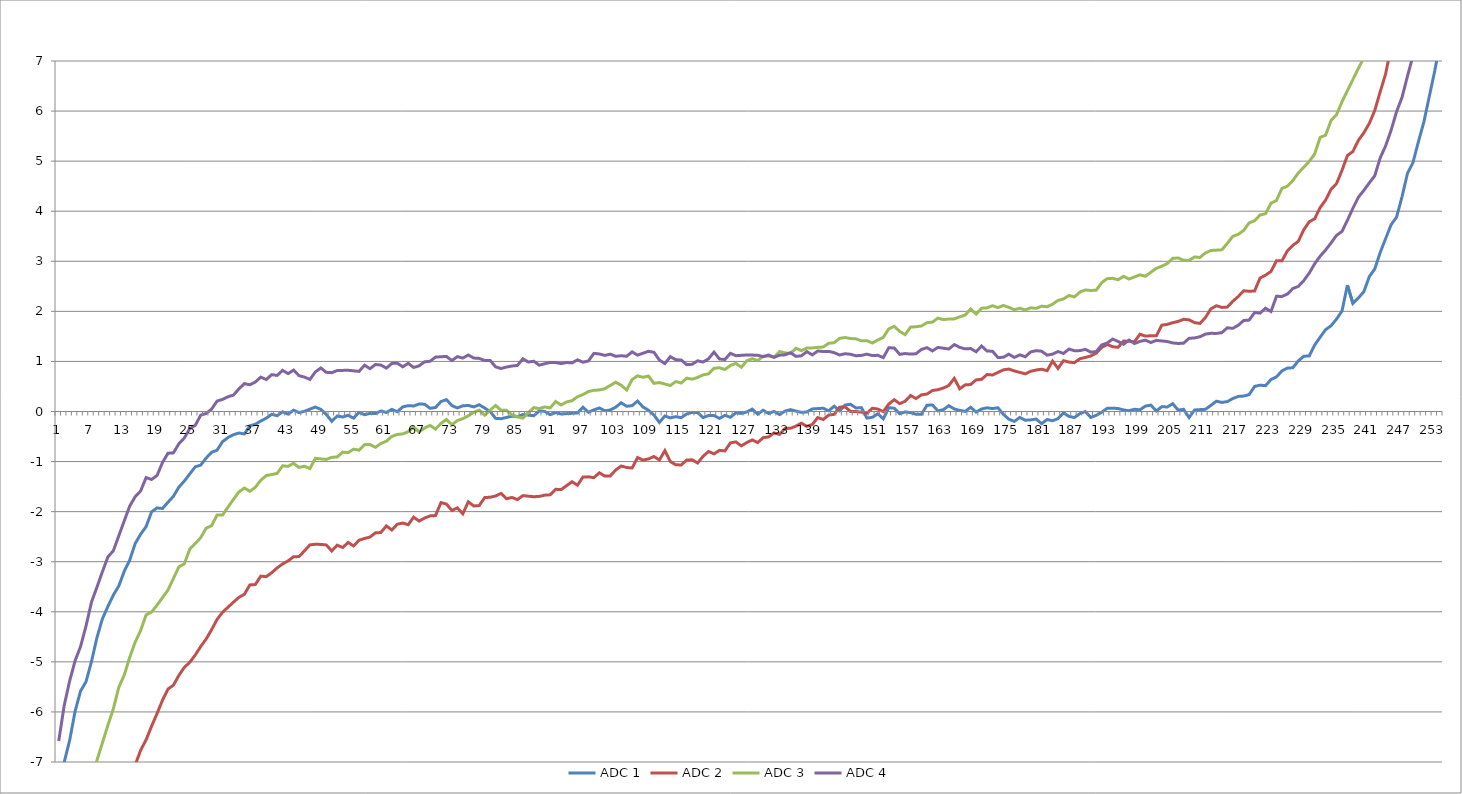
| Category | ADC 1 | ADC 2 | ADC 3 | ADC 4 |
|---|---|---|---|---|
| 0 | -7.732 | -15.212 | -11.184 | -6.581 |
| 1 | -7.006 | -13.64 | -9.972 | -5.873 |
| 2 | -6.567 | -12.968 | -9.417 | -5.381 |
| 3 | -5.985 | -12.062 | -8.79 | -4.978 |
| 4 | -5.583 | -11.399 | -8.37 | -4.693 |
| 5 | -5.396 | -10.862 | -7.913 | -4.281 |
| 6 | -4.993 | -10.352 | -7.443 | -3.807 |
| 7 | -4.515 | -9.769 | -6.964 | -3.508 |
| 8 | -4.139 | -9.358 | -6.616 | -3.2 |
| 9 | -3.894 | -8.982 | -6.267 | -2.905 |
| 10 | -3.667 | -8.571 | -5.937 | -2.781 |
| 11 | -3.485 | -8.231 | -5.507 | -2.482 |
| 12 | -3.19 | -7.874 | -5.262 | -2.183 |
| 13 | -2.967 | -7.525 | -4.909 | -1.889 |
| 14 | -2.637 | -7.06 | -4.606 | -1.702 |
| 15 | -2.45 | -6.765 | -4.374 | -1.587 |
| 16 | -2.299 | -6.556 | -4.062 | -1.32 |
| 17 | -2.005 | -6.284 | -4.005 | -1.358 |
| 18 | -1.926 | -6.035 | -3.868 | -1.279 |
| 19 | -1.937 | -5.767 | -3.717 | -1.02 |
| 20 | -1.813 | -5.544 | -3.566 | -0.833 |
| 21 | -1.694 | -5.465 | -3.335 | -0.827 |
| 22 | -1.512 | -5.27 | -3.103 | -0.644 |
| 23 | -1.388 | -5.11 | -3.042 | -0.53 |
| 24 | -1.246 | -5.009 | -2.748 | -0.338 |
| 25 | -1.105 | -4.863 | -2.637 | -0.278 |
| 26 | -1.071 | -4.694 | -2.518 | -0.073 |
| 27 | -0.929 | -4.543 | -2.332 | -0.039 |
| 28 | -0.814 | -4.356 | -2.28 | 0.049 |
| 29 | -0.771 | -4.152 | -2.066 | 0.208 |
| 30 | -0.603 | -4.01 | -2.068 | 0.242 |
| 31 | -0.519 | -3.909 | -1.908 | 0.294 |
| 32 | -0.463 | -3.807 | -1.753 | 0.328 |
| 33 | -0.429 | -3.711 | -1.607 | 0.452 |
| 34 | -0.449 | -3.65 | -1.528 | 0.558 |
| 35 | -0.285 | -3.463 | -1.593 | 0.533 |
| 36 | -0.256 | -3.456 | -1.514 | 0.589 |
| 37 | -0.19 | -3.288 | -1.373 | 0.686 |
| 38 | -0.134 | -3.299 | -1.28 | 0.639 |
| 39 | -0.055 | -3.22 | -1.26 | 0.736 |
| 40 | -0.084 | -3.123 | -1.235 | 0.72 |
| 41 | -0.006 | -3.044 | -1.084 | 0.822 |
| 42 | -0.053 | -2.983 | -1.095 | 0.757 |
| 43 | 0.026 | -2.9 | -1.035 | 0.826 |
| 44 | -0.021 | -2.898 | -1.118 | 0.716 |
| 45 | 0.004 | -2.783 | -1.093 | 0.687 |
| 46 | 0.047 | -2.664 | -1.14 | 0.64 |
| 47 | 0.09 | -2.652 | -0.935 | 0.791 |
| 48 | 0.043 | -2.654 | -0.946 | 0.87 |
| 49 | -0.058 | -2.665 | -0.957 | 0.782 |
| 50 | -0.195 | -2.784 | -0.914 | 0.776 |
| 51 | -0.089 | -2.67 | -0.908 | 0.819 |
| 52 | -0.11 | -2.717 | -0.811 | 0.821 |
| 53 | -0.076 | -2.615 | -0.822 | 0.823 |
| 54 | -0.132 | -2.685 | -0.752 | 0.812 |
| 55 | -0.017 | -2.57 | -0.772 | 0.801 |
| 56 | -0.064 | -2.536 | -0.662 | 0.925 |
| 57 | -0.039 | -2.507 | -0.659 | 0.855 |
| 58 | -0.041 | -2.424 | -0.716 | 0.939 |
| 59 | 0.011 | -2.417 | -0.637 | 0.928 |
| 60 | -0.018 | -2.284 | -0.594 | 0.867 |
| 61 | 0.042 | -2.367 | -0.497 | 0.959 |
| 62 | -0.005 | -2.252 | -0.459 | 0.966 |
| 63 | 0.092 | -2.227 | -0.447 | 0.892 |
| 64 | 0.117 | -2.261 | -0.404 | 0.962 |
| 65 | 0.11 | -2.11 | -0.308 | 0.879 |
| 66 | 0.149 | -2.189 | -0.409 | 0.913 |
| 67 | 0.147 | -2.128 | -0.33 | 0.992 |
| 68 | 0.064 | -2.085 | -0.278 | 1.003 |
| 69 | 0.079 | -2.078 | -0.352 | 1.086 |
| 70 | 0.199 | -1.82 | -0.237 | 1.093 |
| 71 | 0.237 | -1.849 | -0.158 | 1.1 |
| 72 | 0.118 | -1.977 | -0.264 | 1.017 |
| 73 | 0.071 | -1.925 | -0.181 | 1.096 |
| 74 | 0.114 | -2.044 | -0.142 | 1.067 |
| 75 | 0.121 | -1.803 | -0.086 | 1.128 |
| 76 | 0.092 | -1.886 | -0.016 | 1.067 |
| 77 | 0.135 | -1.879 | 0.027 | 1.061 |
| 78 | 0.07 | -1.719 | -0.074 | 1.018 |
| 79 | 0 | -1.713 | 0.027 | 1.02 |
| 80 | -0.137 | -1.688 | 0.119 | 0.892 |
| 81 | -0.143 | -1.636 | 0.027 | 0.859 |
| 82 | -0.119 | -1.741 | 0.025 | 0.888 |
| 83 | -0.094 | -1.716 | -0.067 | 0.909 |
| 84 | -0.105 | -1.759 | -0.105 | 0.92 |
| 85 | -0.062 | -1.68 | -0.134 | 1.053 |
| 86 | -0.073 | -1.691 | -0.019 | 0.988 |
| 87 | -0.084 | -1.702 | 0.078 | 1.004 |
| 88 | 0.013 | -1.696 | 0.058 | 0.925 |
| 89 | 0.002 | -1.671 | 0.091 | 0.954 |
| 90 | -0.064 | -1.664 | 0.071 | 0.979 |
| 91 | -0.021 | -1.553 | 0.2 | 0.977 |
| 92 | -0.05 | -1.56 | 0.13 | 0.957 |
| 93 | -0.043 | -1.481 | 0.191 | 0.978 |
| 94 | -0.036 | -1.402 | 0.216 | 0.971 |
| 95 | -0.029 | -1.472 | 0.295 | 1.032 |
| 96 | 0.086 | -1.308 | 0.337 | 0.985 |
| 97 | -0.015 | -1.305 | 0.398 | 1.01 |
| 98 | 0.032 | -1.321 | 0.423 | 1.16 |
| 99 | 0.07 | -1.224 | 0.43 | 1.149 |
| 100 | 0.014 | -1.289 | 0.455 | 1.12 |
| 101 | 0.03 | -1.287 | 0.52 | 1.145 |
| 102 | 0.087 | -1.168 | 0.586 | 1.102 |
| 103 | 0.174 | -1.089 | 0.525 | 1.114 |
| 104 | 0.105 | -1.118 | 0.429 | 1.103 |
| 105 | 0.116 | -1.129 | 0.638 | 1.191 |
| 106 | 0.209 | -0.92 | 0.712 | 1.126 |
| 107 | 0.09 | -0.971 | 0.683 | 1.164 |
| 108 | 0.025 | -0.946 | 0.708 | 1.202 |
| 109 | -0.072 | -0.899 | 0.562 | 1.182 |
| 110 | -0.218 | -0.969 | 0.578 | 1.027 |
| 111 | -0.09 | -0.782 | 0.549 | 0.958 |
| 112 | -0.128 | -1 | 0.52 | 1.095 |
| 113 | -0.103 | -1.065 | 0.598 | 1.034 |
| 114 | -0.123 | -1.067 | 0.569 | 1.028 |
| 115 | -0.049 | -0.97 | 0.666 | 0.936 |
| 116 | -0.019 | -0.963 | 0.646 | 0.943 |
| 117 | -0.021 | -1.028 | 0.68 | 1.013 |
| 118 | -0.122 | -0.895 | 0.732 | 0.988 |
| 119 | -0.079 | -0.799 | 0.752 | 1.053 |
| 120 | -0.082 | -0.846 | 0.862 | 1.186 |
| 121 | -0.138 | -0.776 | 0.874 | 1.049 |
| 122 | -0.077 | -0.787 | 0.84 | 1.038 |
| 123 | -0.115 | -0.627 | 0.919 | 1.162 |
| 124 | -0.027 | -0.607 | 0.962 | 1.115 |
| 125 | -0.038 | -0.685 | 0.883 | 1.122 |
| 126 | -0.009 | -0.62 | 1.012 | 1.128 |
| 127 | 0.048 | -0.568 | 1.054 | 1.126 |
| 128 | -0.053 | -0.62 | 1.016 | 1.124 |
| 129 | 0.025 | -0.523 | 1.104 | 1.095 |
| 130 | -0.04 | -0.507 | 1.107 | 1.129 |
| 131 | 0.003 | -0.428 | 1.082 | 1.082 |
| 132 | -0.062 | -0.457 | 1.197 | 1.125 |
| 133 | 0.008 | -0.338 | 1.172 | 1.132 |
| 134 | 0.037 | -0.336 | 1.157 | 1.175 |
| 135 | 0.008 | -0.293 | 1.262 | 1.101 |
| 136 | -0.016 | -0.232 | 1.215 | 1.112 |
| 137 | -0.009 | -0.297 | 1.267 | 1.195 |
| 138 | 0.051 | -0.259 | 1.27 | 1.13 |
| 139 | 0.058 | -0.121 | 1.281 | 1.209 |
| 140 | 0.065 | -0.16 | 1.288 | 1.198 |
| 141 | 0.014 | -0.072 | 1.362 | 1.2 |
| 142 | 0.106 | -0.056 | 1.374 | 1.176 |
| 143 | 0.014 | 0.086 | 1.461 | 1.129 |
| 144 | 0.129 | 0.093 | 1.477 | 1.154 |
| 145 | 0.145 | 0.001 | 1.457 | 1.143 |
| 146 | 0.071 | -0.001 | 1.451 | 1.113 |
| 147 | 0.077 | -0.012 | 1.413 | 1.12 |
| 148 | -0.131 | -0.032 | 1.415 | 1.145 |
| 149 | -0.116 | 0.064 | 1.368 | 1.116 |
| 150 | -0.046 | 0.049 | 1.429 | 1.123 |
| 151 | -0.147 | -0.003 | 1.481 | 1.076 |
| 152 | 0.076 | 0.148 | 1.649 | 1.272 |
| 153 | 0.065 | 0.236 | 1.701 | 1.27 |
| 154 | -0.045 | 0.157 | 1.6 | 1.142 |
| 155 | -0.007 | 0.205 | 1.535 | 1.157 |
| 156 | -0.022 | 0.319 | 1.686 | 1.146 |
| 157 | -0.056 | 0.259 | 1.693 | 1.153 |
| 158 | -0.053 | 0.333 | 1.709 | 1.241 |
| 159 | 0.124 | 0.349 | 1.774 | 1.275 |
| 160 | 0.131 | 0.419 | 1.785 | 1.21 |
| 161 | 0.012 | 0.435 | 1.864 | 1.28 |
| 162 | 0.037 | 0.469 | 1.835 | 1.264 |
| 163 | 0.116 | 0.52 | 1.846 | 1.249 |
| 164 | 0.051 | 0.662 | 1.849 | 1.336 |
| 165 | 0.022 | 0.453 | 1.892 | 1.28 |
| 166 | 0.002 | 0.532 | 1.925 | 1.251 |
| 167 | 0.085 | 0.539 | 2.049 | 1.258 |
| 168 | -0.012 | 0.631 | 1.944 | 1.193 |
| 169 | 0.049 | 0.643 | 2.063 | 1.308 |
| 170 | 0.074 | 0.739 | 2.07 | 1.207 |
| 171 | 0.059 | 0.728 | 2.113 | 1.205 |
| 172 | 0.074 | 0.78 | 2.075 | 1.077 |
| 173 | -0.058 | 0.832 | 2.118 | 1.084 |
| 174 | -0.155 | 0.848 | 2.08 | 1.145 |
| 175 | -0.197 | 0.81 | 2.032 | 1.08 |
| 176 | -0.118 | 0.781 | 2.062 | 1.131 |
| 177 | -0.174 | 0.752 | 2.028 | 1.093 |
| 178 | -0.167 | 0.804 | 2.071 | 1.19 |
| 179 | -0.152 | 0.828 | 2.06 | 1.215 |
| 180 | -0.244 | 0.844 | 2.103 | 1.204 |
| 181 | -0.16 | 0.815 | 2.092 | 1.125 |
| 182 | -0.185 | 1.006 | 2.144 | 1.146 |
| 183 | -0.142 | 0.86 | 2.218 | 1.198 |
| 184 | -0.027 | 1.016 | 2.247 | 1.159 |
| 185 | -0.097 | 0.987 | 2.317 | 1.247 |
| 186 | -0.121 | 0.975 | 2.288 | 1.214 |
| 187 | -0.042 | 1.054 | 2.385 | 1.216 |
| 188 | 0 | 1.079 | 2.428 | 1.241 |
| 189 | -0.119 | 1.109 | 2.417 | 1.185 |
| 190 | -0.076 | 1.165 | 2.423 | 1.196 |
| 191 | -0.015 | 1.28 | 2.574 | 1.329 |
| 192 | 0.064 | 1.34 | 2.653 | 1.367 |
| 193 | 0.066 | 1.293 | 2.66 | 1.446 |
| 194 | 0.06 | 1.282 | 2.631 | 1.399 |
| 195 | 0.031 | 1.406 | 2.701 | 1.343 |
| 196 | 0.015 | 1.404 | 2.645 | 1.426 |
| 197 | 0.044 | 1.393 | 2.687 | 1.357 |
| 198 | 0.033 | 1.544 | 2.73 | 1.4 |
| 199 | 0.108 | 1.506 | 2.701 | 1.425 |
| 200 | 0.128 | 1.512 | 2.78 | 1.378 |
| 201 | 0.009 | 1.51 | 2.859 | 1.42 |
| 202 | 0.097 | 1.724 | 2.902 | 1.409 |
| 203 | 0.09 | 1.74 | 2.954 | 1.398 |
| 204 | 0.156 | 1.774 | 3.059 | 1.369 |
| 205 | 0.028 | 1.799 | 3.066 | 1.358 |
| 206 | 0.043 | 1.841 | 3.019 | 1.365 |
| 207 | -0.12 | 1.83 | 3.017 | 1.462 |
| 208 | 0.03 | 1.774 | 3.087 | 1.469 |
| 209 | 0.037 | 1.759 | 3.076 | 1.494 |
| 210 | 0.044 | 1.878 | 3.168 | 1.545 |
| 211 | 0.123 | 2.051 | 3.215 | 1.561 |
| 212 | 0.206 | 2.112 | 3.222 | 1.559 |
| 213 | 0.182 | 2.079 | 3.229 | 1.575 |
| 214 | 0.197 | 2.085 | 3.357 | 1.672 |
| 215 | 0.258 | 2.2 | 3.499 | 1.661 |
| 216 | 0.301 | 2.297 | 3.538 | 1.722 |
| 217 | 0.308 | 2.412 | 3.616 | 1.818 |
| 218 | 0.337 | 2.401 | 3.767 | 1.825 |
| 219 | 0.502 | 2.408 | 3.81 | 1.976 |
| 220 | 0.526 | 2.666 | 3.925 | 1.965 |
| 221 | 0.515 | 2.722 | 3.95 | 2.062 |
| 222 | 0.639 | 2.797 | 4.159 | 1.997 |
| 223 | 0.691 | 3.01 | 4.215 | 2.3 |
| 224 | 0.81 | 3.008 | 4.456 | 2.298 |
| 225 | 0.867 | 3.209 | 4.499 | 2.345 |
| 226 | 0.873 | 3.319 | 4.613 | 2.456 |
| 227 | 1.011 | 3.398 | 4.764 | 2.499 |
| 228 | 1.103 | 3.629 | 4.879 | 2.613 |
| 229 | 1.11 | 3.789 | 4.994 | 2.764 |
| 230 | 1.328 | 3.85 | 5.144 | 2.951 |
| 231 | 1.483 | 4.072 | 5.475 | 3.102 |
| 232 | 1.634 | 4.223 | 5.518 | 3.225 |
| 233 | 1.713 | 4.437 | 5.812 | 3.367 |
| 234 | 1.846 | 4.552 | 5.927 | 3.518 |
| 235 | 2.005 | 4.815 | 6.186 | 3.597 |
| 236 | 2.525 | 5.114 | 6.408 | 3.819 |
| 237 | 2.158 | 5.193 | 6.631 | 4.06 |
| 238 | 2.269 | 5.415 | 6.854 | 4.278 |
| 239 | 2.392 | 5.566 | 7.058 | 4.415 |
| 240 | 2.692 | 5.753 | 7.263 | 4.566 |
| 241 | 2.847 | 6.011 | 7.612 | 4.708 |
| 242 | 3.177 | 6.387 | 7.888 | 5.065 |
| 243 | 3.454 | 6.744 | 8.255 | 5.306 |
| 244 | 3.73 | 7.291 | 8.603 | 5.618 |
| 245 | 3.881 | 7.567 | 9.06 | 5.989 |
| 246 | 4.293 | 7.916 | 9.561 | 6.275 |
| 247 | 4.758 | 8.498 | 9.972 | 6.7 |
| 248 | 4.972 | 8.941 | 10.537 | 7.102 |
| 249 | 5.388 | 9.438 | 11.191 | 7.613 |
| 250 | 5.786 | 10.155 | 11.899 | 8.087 |
| 251 | 6.296 | 10.683 | 12.553 | 8.525 |
| 252 | 6.811 | 11.481 | 13.279 | 8.964 |
| 253 | 7.389 | 13.142 | 14.868 | 10.265 |